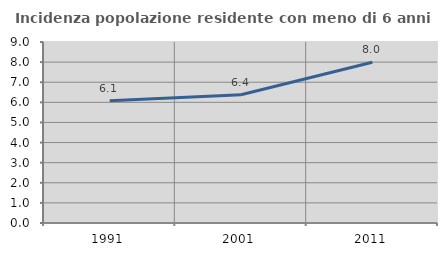
| Category | Incidenza popolazione residente con meno di 6 anni |
|---|---|
| 1991.0 | 6.073 |
| 2001.0 | 6.376 |
| 2011.0 | 7.993 |